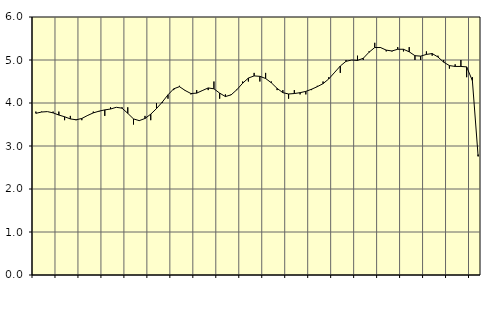
| Category | Piggar | Series 1 |
|---|---|---|
| nan | 3.8 | 3.76 |
| 1.0 | 3.8 | 3.79 |
| 1.0 | 3.8 | 3.8 |
| 1.0 | 3.8 | 3.77 |
| nan | 3.8 | 3.72 |
| 2.0 | 3.6 | 3.68 |
| 2.0 | 3.7 | 3.63 |
| 2.0 | 3.6 | 3.61 |
| nan | 3.6 | 3.64 |
| 3.0 | 3.7 | 3.71 |
| 3.0 | 3.8 | 3.77 |
| 3.0 | 3.8 | 3.81 |
| nan | 3.7 | 3.84 |
| 4.0 | 3.9 | 3.86 |
| 4.0 | 3.9 | 3.9 |
| 4.0 | 3.9 | 3.88 |
| nan | 3.9 | 3.76 |
| 5.0 | 3.5 | 3.63 |
| 5.0 | 3.6 | 3.59 |
| 5.0 | 3.7 | 3.64 |
| nan | 3.6 | 3.74 |
| 6.0 | 4 | 3.87 |
| 6.0 | 4 | 4.02 |
| 6.0 | 4.1 | 4.19 |
| nan | 4.3 | 4.33 |
| 7.0 | 4.4 | 4.38 |
| 7.0 | 4.3 | 4.29 |
| 7.0 | 4.2 | 4.22 |
| nan | 4.3 | 4.23 |
| 8.0 | 4.3 | 4.29 |
| 8.0 | 4.3 | 4.35 |
| 8.0 | 4.5 | 4.33 |
| nan | 4.1 | 4.23 |
| 9.0 | 4.2 | 4.15 |
| 9.0 | 4.2 | 4.19 |
| 9.0 | 4.3 | 4.31 |
| nan | 4.5 | 4.46 |
| 10.0 | 4.5 | 4.58 |
| 10.0 | 4.7 | 4.63 |
| 10.0 | 4.5 | 4.62 |
| nan | 4.7 | 4.57 |
| 11.0 | 4.5 | 4.47 |
| 11.0 | 4.3 | 4.34 |
| 11.0 | 4.3 | 4.24 |
| nan | 4.1 | 4.21 |
| 12.0 | 4.3 | 4.22 |
| 12.0 | 4.2 | 4.24 |
| 12.0 | 4.2 | 4.27 |
| nan | 4.3 | 4.32 |
| 13.0 | 4.4 | 4.38 |
| 13.0 | 4.5 | 4.45 |
| 13.0 | 4.6 | 4.56 |
| nan | 4.7 | 4.71 |
| 14.0 | 4.7 | 4.86 |
| 14.0 | 5 | 4.97 |
| 14.0 | 5 | 5 |
| nan | 5.1 | 4.99 |
| 15.0 | 5 | 5.04 |
| 15.0 | 5.2 | 5.18 |
| 15.0 | 5.4 | 5.29 |
| nan | 5.3 | 5.29 |
| 16.0 | 5.2 | 5.23 |
| 16.0 | 5.2 | 5.21 |
| 16.0 | 5.3 | 5.25 |
| nan | 5.2 | 5.25 |
| 17.0 | 5.3 | 5.19 |
| 17.0 | 5 | 5.1 |
| 17.0 | 5 | 5.09 |
| nan | 5.2 | 5.13 |
| 18.0 | 5.1 | 5.15 |
| 18.0 | 5.1 | 5.07 |
| 18.0 | 5 | 4.95 |
| nan | 4.8 | 4.87 |
| 19.0 | 4.9 | 4.85 |
| 19.0 | 5 | 4.85 |
| 19.0 | 4.6 | 4.84 |
| nan | 4.6 | 4.52 |
| 20.0 | 2.8 | 2.76 |